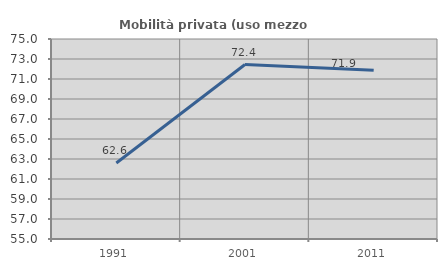
| Category | Mobilità privata (uso mezzo privato) |
|---|---|
| 1991.0 | 62.597 |
| 2001.0 | 72.446 |
| 2011.0 | 71.87 |